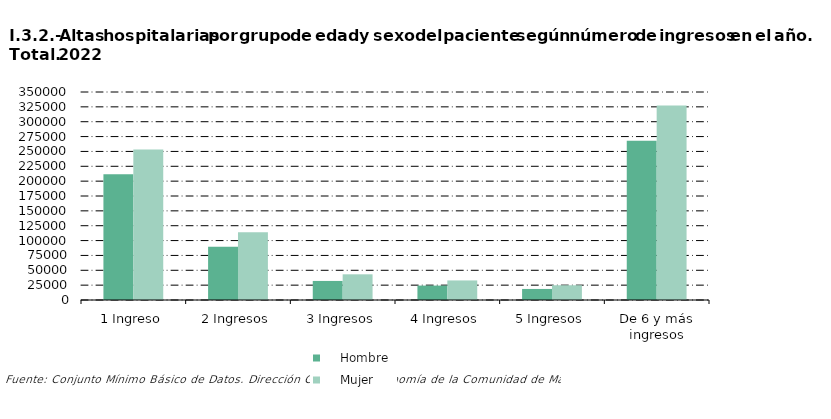
| Category |     Hombre |     Mujer |
|---|---|---|
| 1 Ingreso | 211774 | 253164 |
| 2 Ingresos | 89730 | 114074 |
| 3 Ingresos | 32073 | 43217 |
| 4 Ingresos | 24248 | 32916 |
| 5 Ingresos | 18587 | 24817 |
| De 6 y más ingresos | 267975 | 327203 |